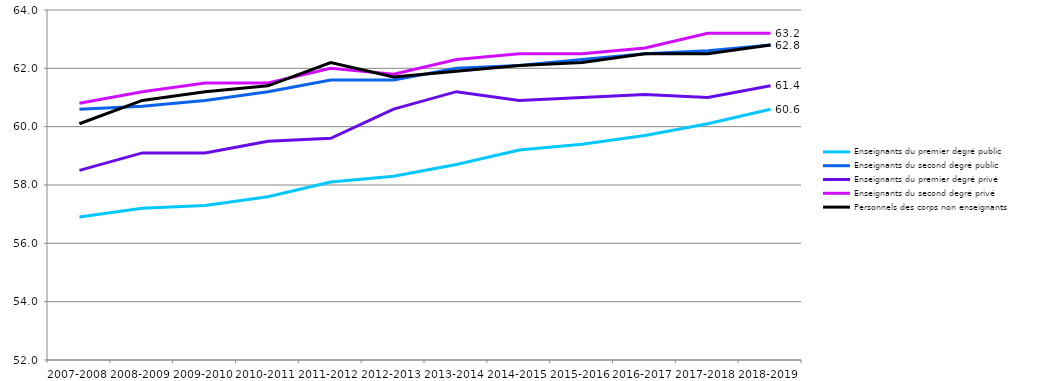
| Category | Enseignants du premier degré public | Enseignants du second degré public | Enseignants du premier degré privé | Enseignants du second degré privé | Personnels des corps non enseignants  |
|---|---|---|---|---|---|
| 2007-2008 | 56.9 | 60.6 | 58.5 | 60.8 | 60.1 |
| 2008-2009 | 57.2 | 60.7 | 59.1 | 61.2 | 60.9 |
| 2009-2010 | 57.3 | 60.9 | 59.1 | 61.5 | 61.2 |
| 2010-2011 | 57.6 | 61.2 | 59.5 | 61.5 | 61.4 |
| 2011-2012 | 58.1 | 61.6 | 59.6 | 62 | 62.2 |
| 2012-2013 | 58.3 | 61.6 | 60.6 | 61.8 | 61.7 |
| 2013-2014 | 58.7 | 62 | 61.2 | 62.3 | 61.9 |
| 2014-2015 | 59.2 | 62.1 | 60.9 | 62.5 | 62.1 |
| 2015-2016 | 59.4 | 62.3 | 61 | 62.5 | 62.2 |
| 2016-2017 | 59.7 | 62.5 | 61.1 | 62.7 | 62.5 |
| 2017-2018 | 60.1 | 62.6 | 61 | 63.2 | 62.5 |
| 2018-2019 | 60.6 | 62.8 | 61.4 | 63.2 | 62.8 |